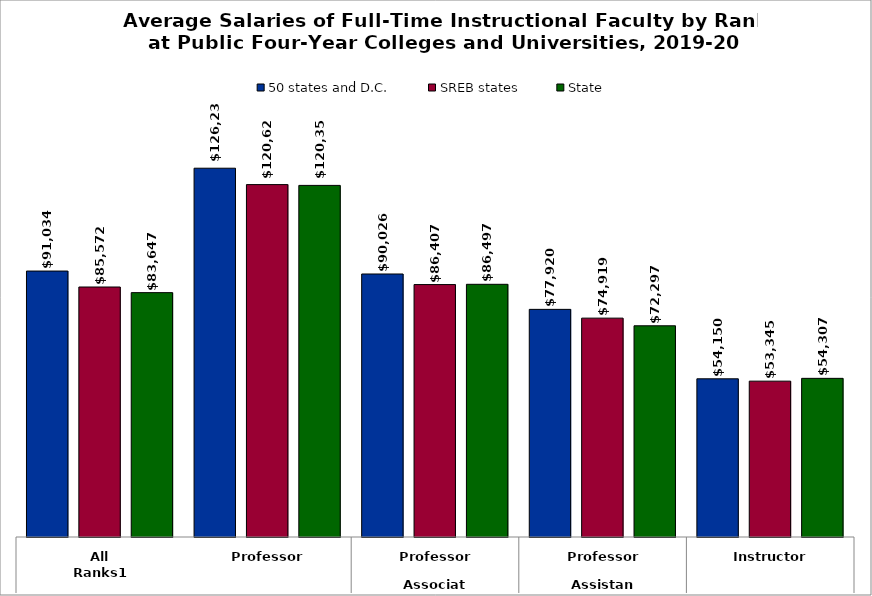
| Category | 50 states and D.C. | SREB states | State |
|---|---|---|---|
| 0 | 91033.679 | 85571.975 | 83647.058 |
| 1 | 126235.207 | 120625.308 | 120353.305 |
| 2 | 90025.831 | 86406.778 | 86496.797 |
| 3 | 77920.157 | 74918.593 | 72297.212 |
| 4 | 54149.707 | 53345.294 | 54306.572 |